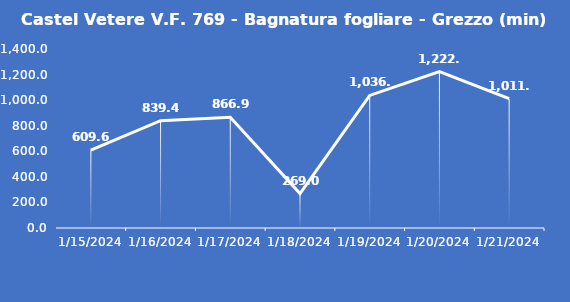
| Category | Castel Vetere V.F. 769 - Bagnatura fogliare - Grezzo (min) |
|---|---|
| 1/15/24 | 609.6 |
| 1/16/24 | 839.4 |
| 1/17/24 | 866.9 |
| 1/18/24 | 269 |
| 1/19/24 | 1036.8 |
| 1/20/24 | 1222.6 |
| 1/21/24 | 1011.9 |